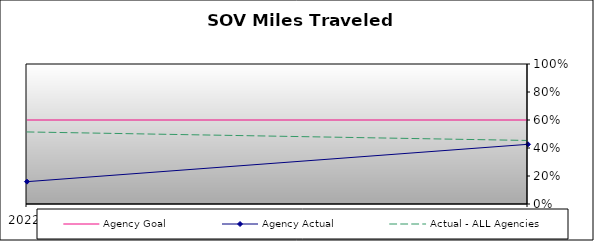
| Category | Agency Goal | Agency Actual | Actual - ALL Agencies |
|---|---|---|---|
| 2022.0 | 0.6 | 0.16 | 0.515 |
| 2023.0 | 0.6 | 0.426 | 0.454 |